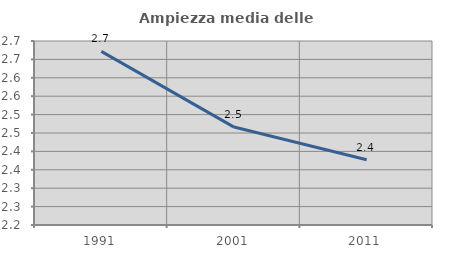
| Category | Ampiezza media delle famiglie |
|---|---|
| 1991.0 | 2.672 |
| 2001.0 | 2.466 |
| 2011.0 | 2.378 |